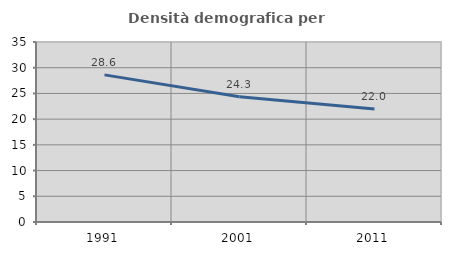
| Category | Densità demografica |
|---|---|
| 1991.0 | 28.609 |
| 2001.0 | 24.338 |
| 2011.0 | 21.967 |